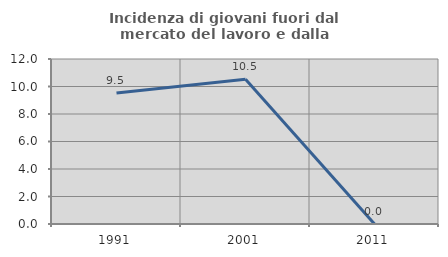
| Category | Incidenza di giovani fuori dal mercato del lavoro e dalla formazione  |
|---|---|
| 1991.0 | 9.524 |
| 2001.0 | 10.526 |
| 2011.0 | 0 |